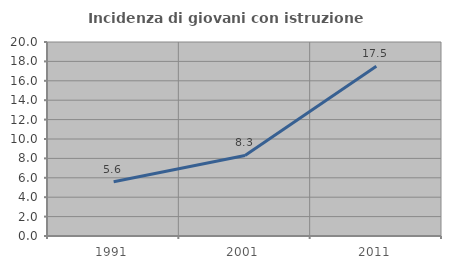
| Category | Incidenza di giovani con istruzione universitaria |
|---|---|
| 1991.0 | 5.594 |
| 2001.0 | 8.303 |
| 2011.0 | 17.498 |